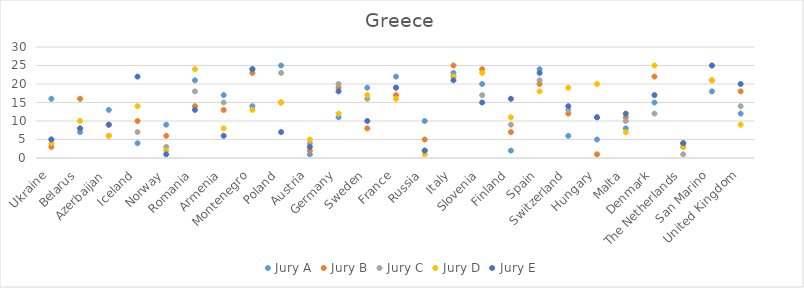
| Category | Jury A | Jury B | Jury C | Jury D | Jury E |
|---|---|---|---|---|---|
| Ukraine | 16 | 3 | 5 | 4 | 5 |
| Belarus | 7 | 16 | 8 | 10 | 8 |
| Azerbaijan | 13 | 9 | 6 | 6 | 9 |
| Iceland | 4 | 10 | 7 | 14 | 22 |
| Norway | 9 | 6 | 3 | 2 | 1 |
| Romania | 21 | 14 | 18 | 24 | 13 |
| Armenia | 17 | 13 | 15 | 8 | 6 |
| Montenegro | 14 | 23 | 24 | 13 | 24 |
| Poland | 25 | 15 | 23 | 15 | 7 |
| Austria | 1 | 2 | 4 | 5 | 3 |
| Germany | 11 | 19 | 20 | 12 | 18 |
| Sweden | 19 | 8 | 16 | 17 | 10 |
| France | 22 | 17 | 19 | 16 | 19 |
| Russia | 10 | 5 | 2 | 1 | 2 |
| Italy | 23 | 25 | 22 | 22 | 21 |
| Slovenia | 20 | 24 | 17 | 23 | 15 |
| Finland | 2 | 7 | 9 | 11 | 16 |
| Spain | 24 | 20 | 21 | 18 | 23 |
| Switzerland | 6 | 12 | 13 | 19 | 14 |
| Hungary | 5 | 1 | 11 | 20 | 11 |
| Malta | 8 | 11 | 10 | 7 | 12 |
| Denmark | 15 | 22 | 12 | 25 | 17 |
| The Netherlands | 3 | 4 | 1 | 3 | 4 |
| San Marino | 18 | 21 | 25 | 21 | 25 |
| United Kingdom | 12 | 18 | 14 | 9 | 20 |